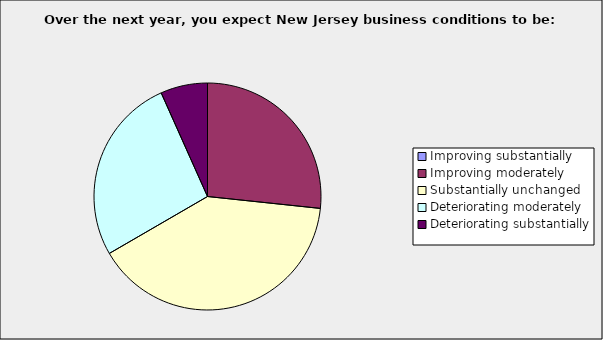
| Category | Series 0 |
|---|---|
| Improving substantially | 0 |
| Improving moderately | 0.267 |
| Substantially unchanged | 0.4 |
| Deteriorating moderately | 0.267 |
| Deteriorating substantially | 0.067 |